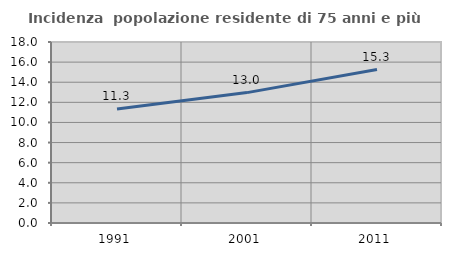
| Category | Incidenza  popolazione residente di 75 anni e più |
|---|---|
| 1991.0 | 11.348 |
| 2001.0 | 12.967 |
| 2011.0 | 15.259 |